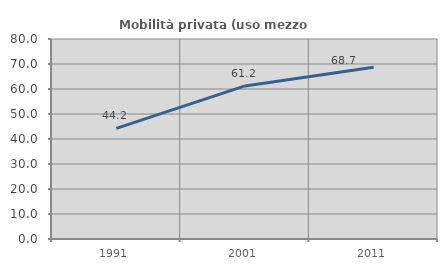
| Category | Mobilità privata (uso mezzo privato) |
|---|---|
| 1991.0 | 44.242 |
| 2001.0 | 61.231 |
| 2011.0 | 68.733 |